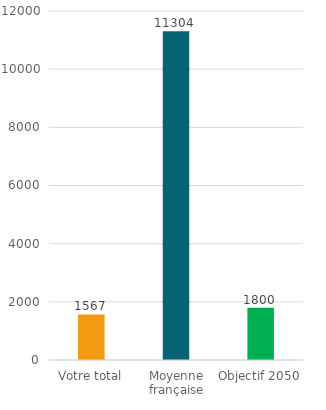
| Category | Series 0 | Series 1 |
|---|---|---|
| Votre total |  | 1567.2 |
| Moyenne française |  | 11304 |
| Objectif 2050 |  | 1800 |